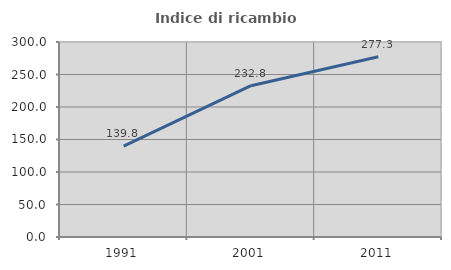
| Category | Indice di ricambio occupazionale  |
|---|---|
| 1991.0 | 139.815 |
| 2001.0 | 232.812 |
| 2011.0 | 277.333 |